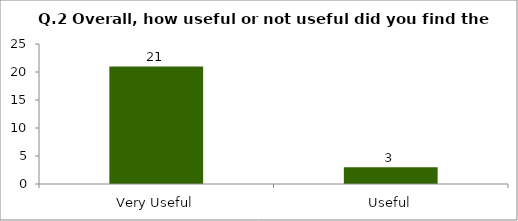
| Category | Q.2 Overall, how useful or not useful did you find the Session? |
|---|---|
| Very Useful | 21 |
| Useful | 3 |